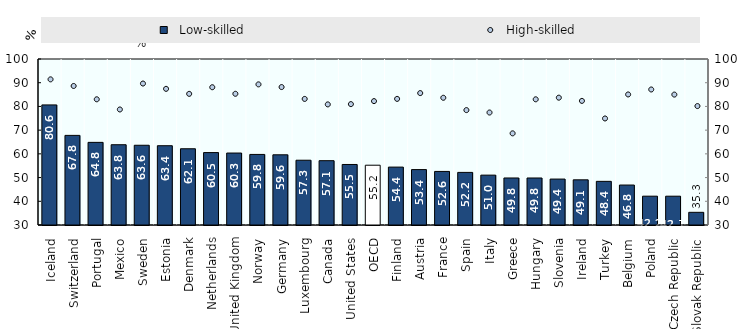
| Category |   Low-skilled |
|---|---|
| Iceland  | 80.637 |
| Switzerland  | 67.788 |
| Portugal  | 64.847 |
| Mexico  | 63.847 |
| Sweden  | 63.625 |
| Estonia  | 63.433 |
| Denmark  | 62.148 |
| Netherlands  | 60.534 |
| United Kingdom  | 60.342 |
| Norway  | 59.758 |
| Germany  | 59.603 |
| Luxembourg  | 57.315 |
| Canada  | 57.122 |
| United States  | 55.525 |
| OECD  | 55.21 |
| Finland  | 54.414 |
| Austria  | 53.366 |
| France  | 52.59 |
| Spain  | 52.178 |
| Italy  | 51.026 |
| Greece  | 49.827 |
| Hungary  | 49.822 |
| Slovenia  | 49.369 |
| Ireland  | 49.053 |
| Turkey  | 48.409 |
| Belgium  | 46.849 |
| Poland  | 42.151 |
| Czech Republic  | 42.148 |
| Slovak Republic  | 35.347 |